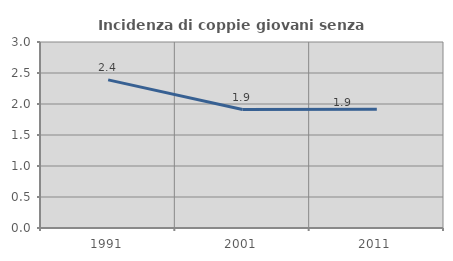
| Category | Incidenza di coppie giovani senza figli |
|---|---|
| 1991.0 | 2.389 |
| 2001.0 | 1.911 |
| 2011.0 | 1.917 |